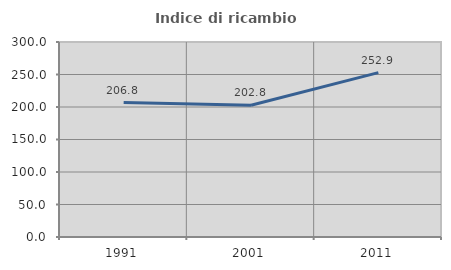
| Category | Indice di ricambio occupazionale  |
|---|---|
| 1991.0 | 206.806 |
| 2001.0 | 202.804 |
| 2011.0 | 252.913 |